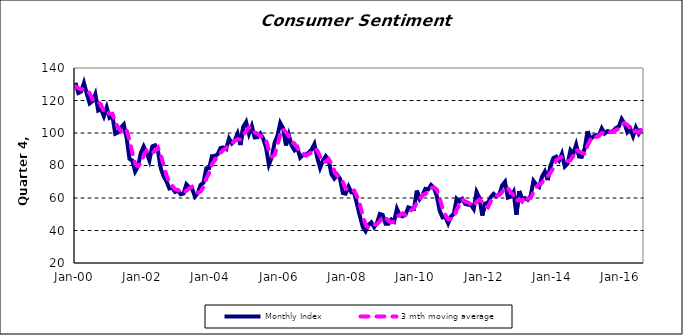
| Category | Monthly Index | 3 mth moving average |
|---|---|---|
| 2000-01-01 | 130.854 | 128.727 |
| 2000-02-01 | 124.642 | 127.553 |
| 2000-03-01 | 125.471 | 126.989 |
| 2000-04-01 | 130.785 | 126.966 |
| 2000-05-01 | 124.1 | 126.785 |
| 2000-06-01 | 118.243 | 124.376 |
| 2000-07-01 | 119.633 | 120.659 |
| 2000-08-01 | 123.854 | 120.577 |
| 2000-09-01 | 113.849 | 119.112 |
| 2000-10-01 | 114.76 | 117.487 |
| 2000-11-01 | 110.348 | 112.986 |
| 2000-12-01 | 115.74 | 113.616 |
| 2001-01-01 | 109.394 | 111.828 |
| 2001-02-01 | 110.585 | 111.907 |
| 2001-03-01 | 99.542 | 106.507 |
| 2001-04-01 | 100.32 | 103.483 |
| 2001-05-01 | 103.365 | 101.076 |
| 2001-06-01 | 105.264 | 102.983 |
| 2001-07-01 | 96.893 | 101.841 |
| 2001-08-01 | 84.156 | 95.438 |
| 2001-09-01 | 82.945 | 87.998 |
| 2001-10-01 | 76.305 | 81.135 |
| 2001-11-01 | 79.442 | 79.564 |
| 2001-12-01 | 87.701 | 81.149 |
| 2002-01-01 | 91.715 | 86.286 |
| 2002-02-01 | 87.952 | 89.123 |
| 2002-03-01 | 83.1 | 87.589 |
| 2002-04-01 | 91.732 | 87.594 |
| 2002-05-01 | 92.449 | 89.094 |
| 2002-06-01 | 88.968 | 91.05 |
| 2002-07-01 | 78.318 | 86.578 |
| 2002-08-01 | 73.284 | 80.19 |
| 2002-09-01 | 70.275 | 73.959 |
| 2002-10-01 | 65.899 | 69.819 |
| 2002-11-01 | 66.462 | 67.545 |
| 2002-12-01 | 63.754 | 65.372 |
| 2003-01-01 | 64.538 | 64.918 |
| 2003-02-01 | 62.348 | 63.547 |
| 2003-03-01 | 62.77 | 63.219 |
| 2003-04-01 | 68.406 | 64.508 |
| 2003-05-01 | 66.543 | 65.906 |
| 2003-06-01 | 65.817 | 66.922 |
| 2003-07-01 | 60.882 | 64.414 |
| 2003-08-01 | 63.048 | 63.249 |
| 2003-09-01 | 68.012 | 63.981 |
| 2003-10-01 | 69.377 | 66.812 |
| 2003-11-01 | 78.239 | 71.876 |
| 2003-12-01 | 78.337 | 75.317 |
| 2004-01-01 | 85.719 | 80.765 |
| 2004-02-01 | 85.823 | 83.293 |
| 2004-03-01 | 86.901 | 86.148 |
| 2004-04-01 | 90.768 | 87.83 |
| 2004-05-01 | 91.067 | 89.578 |
| 2004-06-01 | 90.101 | 90.645 |
| 2004-07-01 | 96.587 | 92.585 |
| 2004-08-01 | 93.595 | 93.427 |
| 2004-09-01 | 95.471 | 95.217 |
| 2004-10-01 | 99.608 | 96.224 |
| 2004-11-01 | 92.605 | 95.895 |
| 2004-12-01 | 103.858 | 98.69 |
| 2005-01-01 | 106.787 | 101.084 |
| 2005-02-01 | 99.524 | 103.39 |
| 2005-03-01 | 104.248 | 103.52 |
| 2005-04-01 | 97.268 | 100.347 |
| 2005-05-01 | 97.391 | 99.636 |
| 2005-06-01 | 99.616 | 98.092 |
| 2005-07-01 | 96.532 | 97.846 |
| 2005-08-01 | 90.996 | 95.714 |
| 2005-09-01 | 80.504 | 89.344 |
| 2005-10-01 | 84.96 | 85.487 |
| 2005-11-01 | 93.966 | 86.477 |
| 2005-12-01 | 98.245 | 92.39 |
| 2006-01-01 | 106.172 | 99.461 |
| 2006-02-01 | 102.898 | 102.438 |
| 2006-03-01 | 92.327 | 100.465 |
| 2006-04-01 | 98.827 | 98.017 |
| 2006-05-01 | 92.311 | 94.488 |
| 2006-06-01 | 89.35 | 93.496 |
| 2006-07-01 | 90.854 | 90.838 |
| 2006-08-01 | 84.831 | 88.345 |
| 2006-09-01 | 86.547 | 87.41 |
| 2006-10-01 | 86.718 | 86.032 |
| 2006-11-01 | 87.859 | 87.041 |
| 2006-12-01 | 89.761 | 88.113 |
| 2007-01-01 | 93.17 | 90.263 |
| 2007-02-01 | 84.86 | 89.264 |
| 2007-03-01 | 78.529 | 85.52 |
| 2007-04-01 | 82.999 | 82.129 |
| 2007-05-01 | 85.732 | 82.42 |
| 2007-06-01 | 83.166 | 83.966 |
| 2007-07-01 | 74.696 | 81.198 |
| 2007-08-01 | 71.97 | 76.611 |
| 2007-09-01 | 74.26 | 73.642 |
| 2007-10-01 | 71.848 | 72.693 |
| 2007-11-01 | 63.082 | 69.73 |
| 2007-12-01 | 62.686 | 65.872 |
| 2008-01-01 | 67.013 | 64.261 |
| 2008-02-01 | 63.502 | 64.4 |
| 2008-03-01 | 63.253 | 64.589 |
| 2008-04-01 | 55.965 | 60.907 |
| 2008-05-01 | 48.813 | 56.011 |
| 2008-06-01 | 42.23 | 49.003 |
| 2008-07-01 | 39.593 | 43.545 |
| 2008-08-01 | 43.372 | 41.731 |
| 2008-09-01 | 45.022 | 42.662 |
| 2008-10-01 | 42.03 | 43.474 |
| 2008-11-01 | 44.769 | 43.94 |
| 2008-12-01 | 50.15 | 45.65 |
| 2009-01-01 | 49.617 | 48.179 |
| 2009-02-01 | 44.201 | 47.99 |
| 2009-03-01 | 44.105 | 45.975 |
| 2009-04-01 | 46.773 | 45.026 |
| 2009-05-01 | 45.478 | 45.452 |
| 2009-06-01 | 53.393 | 48.548 |
| 2009-07-01 | 49.506 | 49.459 |
| 2009-08-01 | 48.726 | 50.541 |
| 2009-09-01 | 49.614 | 49.282 |
| 2009-10-01 | 54.197 | 50.845 |
| 2009-11-01 | 53.578 | 52.463 |
| 2009-12-01 | 53.334 | 53.703 |
| 2010-01-01 | 64.578 | 57.163 |
| 2010-02-01 | 59.383 | 59.098 |
| 2010-03-01 | 61.862 | 61.941 |
| 2010-04-01 | 65.63 | 62.292 |
| 2010-05-01 | 65.286 | 64.259 |
| 2010-06-01 | 67.938 | 66.285 |
| 2010-07-01 | 66.214 | 66.48 |
| 2010-08-01 | 61.426 | 65.193 |
| 2010-09-01 | 52.375 | 60.005 |
| 2010-10-01 | 48.094 | 53.965 |
| 2010-11-01 | 48.365 | 49.611 |
| 2010-12-01 | 44.373 | 46.944 |
| 2011-01-01 | 48.656 | 47.131 |
| 2011-02-01 | 50.295 | 47.775 |
| 2011-03-01 | 59.528 | 52.826 |
| 2011-04-01 | 57.858 | 55.894 |
| 2011-05-01 | 59.365 | 58.917 |
| 2011-06-01 | 56.35 | 57.857 |
| 2011-07-01 | 55.901 | 57.205 |
| 2011-08-01 | 55.829 | 56.027 |
| 2011-09-01 | 53.277 | 55.003 |
| 2011-10-01 | 63.743 | 57.616 |
| 2011-11-01 | 60.076 | 59.032 |
| 2011-12-01 | 49.206 | 57.675 |
| 2012-01-01 | 56.554 | 55.279 |
| 2012-02-01 | 57.034 | 54.265 |
| 2012-03-01 | 60.596 | 58.061 |
| 2012-04-01 | 62.531 | 60.054 |
| 2012-05-01 | 60.96 | 61.362 |
| 2012-06-01 | 62.311 | 61.934 |
| 2012-07-01 | 67.722 | 63.664 |
| 2012-08-01 | 69.97 | 66.668 |
| 2012-09-01 | 60.237 | 65.976 |
| 2012-10-01 | 60.866 | 63.691 |
| 2012-11-01 | 63.757 | 61.62 |
| 2012-12-01 | 49.754 | 58.126 |
| 2013-01-01 | 64.249 | 59.253 |
| 2013-02-01 | 59.369 | 57.791 |
| 2013-03-01 | 59.969 | 61.196 |
| 2013-04-01 | 58.875 | 59.404 |
| 2013-05-01 | 61.196 | 60.013 |
| 2013-06-01 | 70.565 | 63.545 |
| 2013-07-01 | 68.236 | 66.666 |
| 2013-08-01 | 66.818 | 68.539 |
| 2013-09-01 | 73.054 | 69.369 |
| 2013-10-01 | 76.227 | 72.033 |
| 2013-11-01 | 71.023 | 73.435 |
| 2013-12-01 | 79.777 | 75.675 |
| 2014-01-01 | 84.58 | 78.46 |
| 2014-02-01 | 85.481 | 83.279 |
| 2014-03-01 | 83.062 | 84.374 |
| 2014-04-01 | 87.226 | 85.256 |
| 2014-05-01 | 79.386 | 83.225 |
| 2014-06-01 | 81.066 | 82.559 |
| 2014-07-01 | 89.378 | 83.276 |
| 2014-08-01 | 87.115 | 85.853 |
| 2014-09-01 | 92.787 | 89.76 |
| 2014-10-01 | 85.531 | 88.477 |
| 2014-11-01 | 85.345 | 87.887 |
| 2014-12-01 | 90.456 | 87.111 |
| 2015-01-01 | 101.116 | 92.306 |
| 2015-02-01 | 96.098 | 95.89 |
| 2015-03-01 | 97.823 | 98.346 |
| 2015-04-01 | 98.737 | 97.553 |
| 2015-05-01 | 98.456 | 98.339 |
| 2015-06-01 | 102.839 | 100.011 |
| 2015-07-01 | 99.685 | 100.326 |
| 2015-08-01 | 101.136 | 101.22 |
| 2015-09-01 | 100.648 | 100.49 |
| 2015-10-01 | 101.264 | 101.016 |
| 2015-11-01 | 103.107 | 101.673 |
| 2015-12-01 | 103.929 | 102.767 |
| 2016-01-01 | 108.622 | 105.219 |
| 2016-02-01 | 105.761 | 106.104 |
| 2016-03-01 | 100.564 | 104.982 |
| 2016-04-01 | 102.713 | 103.012 |
| 2016-05-01 | 98.059 | 100.445 |
| 2016-06-01 | 103.387 | 101.386 |
| 2016-07-01 | 99.635 | 100.361 |
| 2016-08-01 | 102.694 | 101.906 |